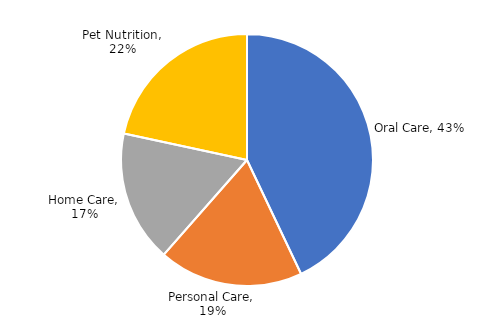
| Category | Series 0 |
|---|---|
| Oral Care | 0.429 |
| Personal Care | 0.185 |
| Home Care | 0.169 |
| Pet Nutrition | 0.216 |